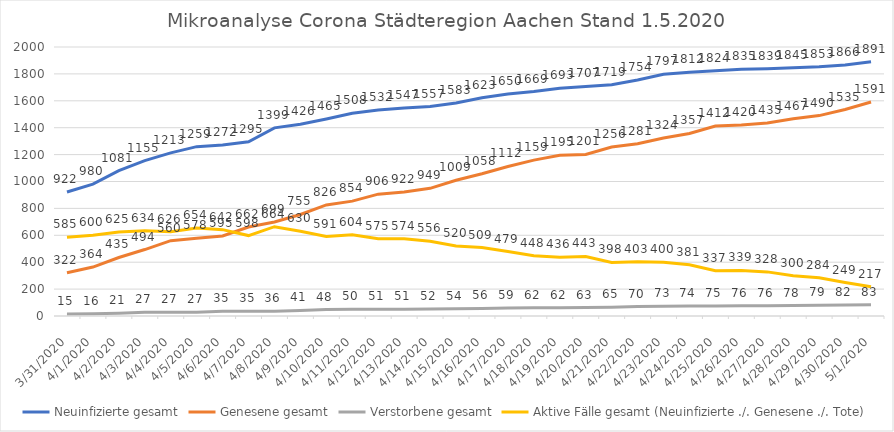
| Category | Neuinfizierte gesamt | Genesene gesamt | Verstorbene gesamt | Aktive Fälle gesamt (Neuinfizierte ./. Genesene ./. Tote)  |
|---|---|---|---|---|
| 3/31/20 | 922 | 322 | 15 | 585 |
| 4/1/20 | 980 | 364 | 16 | 600 |
| 4/2/20 | 1081 | 435 | 21 | 625 |
| 4/3/20 | 1155 | 494 | 27 | 634 |
| 4/4/20 | 1213 | 560 | 27 | 626 |
| 4/5/20 | 1259 | 578 | 27 | 654 |
| 4/6/20 | 1272 | 595 | 35 | 642 |
| 4/7/20 | 1295 | 662 | 35 | 598 |
| 4/8/20 | 1399 | 699 | 36 | 664 |
| 4/9/20 | 1426 | 755 | 41 | 630 |
| 4/10/20 | 1465 | 826 | 48 | 591 |
| 4/11/20 | 1508 | 854 | 50 | 604 |
| 4/12/20 | 1532 | 906 | 51 | 575 |
| 4/13/20 | 1547 | 922 | 51 | 574 |
| 4/14/20 | 1557 | 949 | 52 | 556 |
| 4/15/20 | 1583 | 1009 | 54 | 520 |
| 4/16/20 | 1623 | 1058 | 56 | 509 |
| 4/17/20 | 1650 | 1112 | 59 | 479 |
| 4/18/20 | 1669 | 1159 | 62 | 448 |
| 4/19/20 | 1693 | 1195 | 62 | 436 |
| 4/20/20 | 1707 | 1201 | 63 | 443 |
| 4/21/20 | 1719 | 1256 | 65 | 398 |
| 4/22/20 | 1754 | 1281 | 70 | 403 |
| 4/23/20 | 1797 | 1324 | 73 | 400 |
| 4/24/20 | 1812 | 1357 | 74 | 381 |
| 4/25/20 | 1824 | 1412 | 75 | 337 |
| 4/26/20 | 1835 | 1420 | 76 | 339 |
| 4/27/20 | 1839 | 1435 | 76 | 328 |
| 4/28/20 | 1845 | 1467 | 78 | 300 |
| 4/29/20 | 1853 | 1490 | 79 | 284 |
| 4/30/20 | 1866 | 1535 | 82 | 249 |
| 5/1/20 | 1891 | 1591 | 83 | 217 |